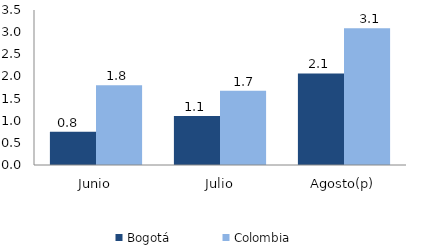
| Category | Bogotá | Colombia |
|---|---|---|
| Junio | 0.752 | 1.799 |
| Julio | 1.105 | 1.674 |
| Agosto(p) | 2.068 | 3.09 |